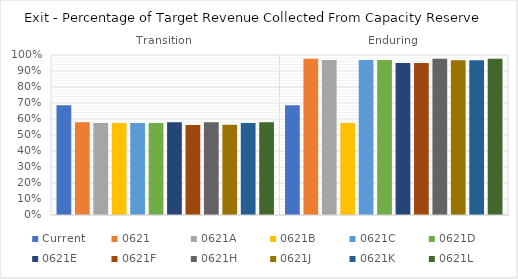
| Category | Current | 0621 | 0621A | 0621B | 0621C | 0621D | 0621E | 0621F | 0621H | 0621J | 0621K | 0621L |
|---|---|---|---|---|---|---|---|---|---|---|---|---|
| Transition | 0.686 | 0.58 | 0.575 | 0.575 | 0.575 | 0.575 | 0.58 | 0.562 | 0.58 | 0.564 | 0.575 | 0.58 |
| Enduring | 0.686 | 0.976 | 0.969 | 0.575 | 0.969 | 0.969 | 0.95 | 0.95 | 0.976 | 0.967 | 0.967 | 0.976 |